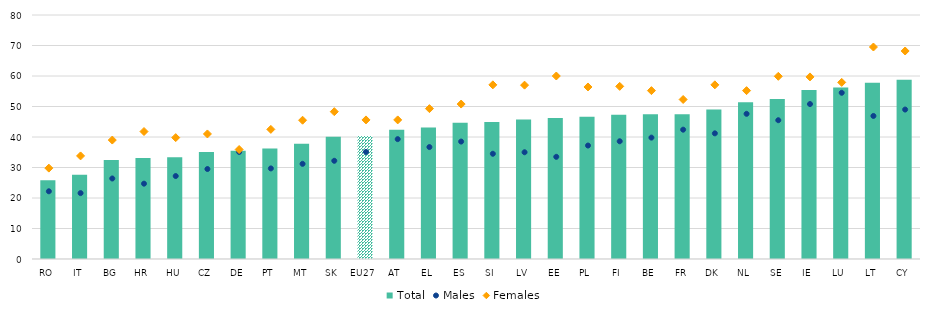
| Category | Total |
|---|---|
| RO | 25.8 |
| IT | 27.6 |
| BG | 32.5 |
| HR | 33.1 |
| HU | 33.4 |
| CZ | 35.1 |
| DE | 35.5 |
| PT | 36.2 |
| MT | 37.8 |
| SK | 40.1 |
| EU27 | 40.3 |
| AT | 42.4 |
| EL | 43.1 |
| ES | 44.7 |
| SI | 44.9 |
| LV | 45.7 |
| EE | 46.2 |
| PL | 46.6 |
| FI | 47.3 |
| BE | 47.5 |
| FR | 47.5 |
| DK | 49 |
| NL | 51.4 |
| SE | 52.5 |
| IE | 55.4 |
| LU | 56.2 |
| LT | 57.8 |
| CY | 58.8 |